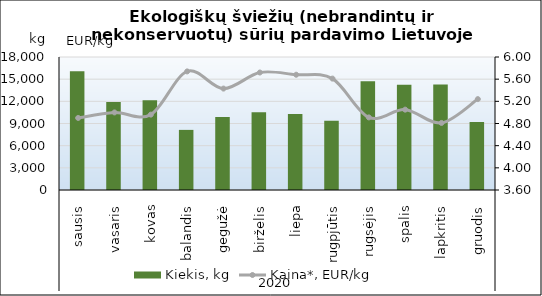
| Category | Kiekis, kg |
|---|---|
| 0 | 16068 |
| 1 | 11920 |
| 2 | 12157 |
| 3 | 8136 |
| 4 | 9888 |
| 5 | 10535 |
| 6 | 10294 |
| 7 | 9378 |
| 8 | 14731 |
| 9 | 14253 |
| 10 | 14277 |
| 11 | 9203 |